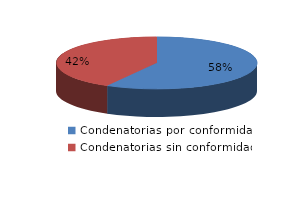
| Category | Series 0 |
|---|---|
| 0 | 491 |
| 1 | 354 |